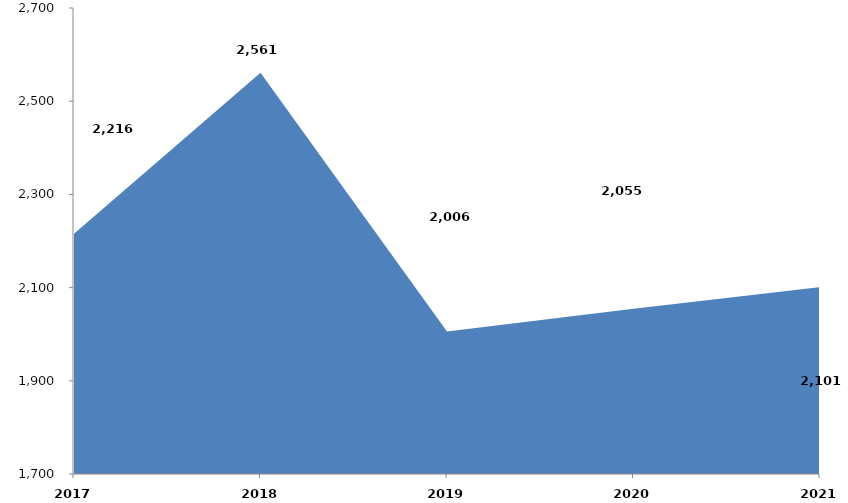
| Category | Series 0 |
|---|---|
| 2017 | 2215623.385 |
| 2018 | 2561094.322 |
| 2019 | 2005795.846 |
| 2020 | 2054668 |
| 2021 | 2100854 |